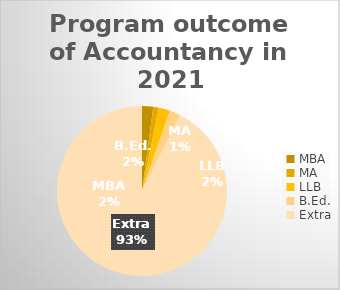
| Category | Series 0 |
|---|---|
| MBA | 2 |
| MA | 1 |
| LLB | 2 |
| B.Ed. | 2 |
| Extra | 87 |